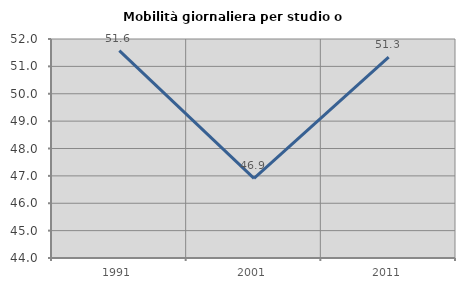
| Category | Mobilità giornaliera per studio o lavoro |
|---|---|
| 1991.0 | 51.573 |
| 2001.0 | 46.911 |
| 2011.0 | 51.337 |